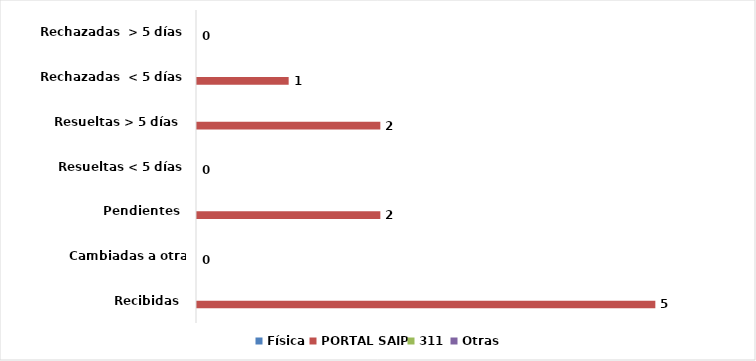
| Category | Física | PORTAL SAIP | 311 | Otras |
|---|---|---|---|---|
| Recibidas  | 0 | 5 | 0 | 0 |
| Cambiadas a otra institución | 0 | 0 | 0 | 0 |
| Pendientes  | 0 | 2 | 0 | 0 |
| Resueltas < 5 días | 0 | 0 | 0 | 0 |
| Resueltas > 5 días  | 0 | 2 | 0 | 0 |
| Rechazadas  < 5 días | 0 | 1 | 0 | 0 |
| Rechazadas  > 5 días | 0 | 0 | 0 | 0 |